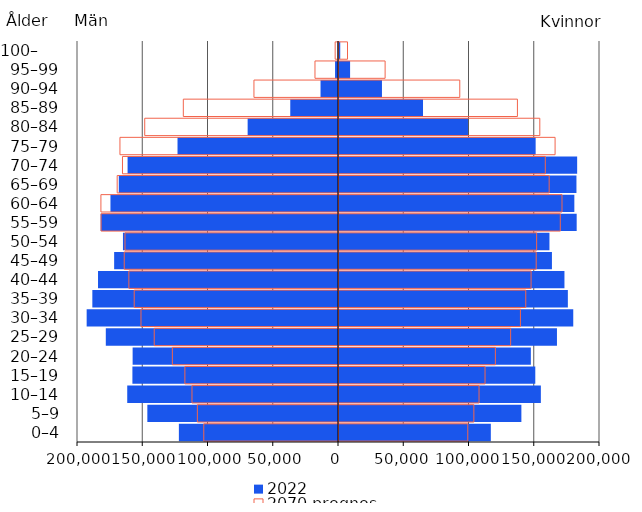
| Category | 2022 | 2070 prognos |
|---|---|---|
| 0–4 | 116348 | 98675 |
| 5–9 | 139754 | 103340 |
| 10–14 | 154687 | 107315 |
| 15–19 | 150416 | 111910 |
| 20–24 | 147012 | 119832 |
| 25–29 | 167020 | 131518 |
| 30–34 | 179506 | 139035 |
| 35–39 | 175371 | 143112 |
| 40–44 | 172759 | 147183 |
| 45–49 | 163165 | 151106 |
| 50–54 | 161264 | 151443 |
| 55–59 | 182134 | 169578 |
| 60–64 | 180339 | 170887 |
| 65–69 | 181956 | 161040 |
| 70–74 | 182494 | 158084 |
| 75–79 | 150690 | 165589 |
| 80–84 | 98839 | 153874 |
| 85–89 | 64374 | 136731 |
| 90–94 | 32918 | 92552 |
| 95–99 | 8498 | 35341 |
| 100–     | 949 | 6515 |